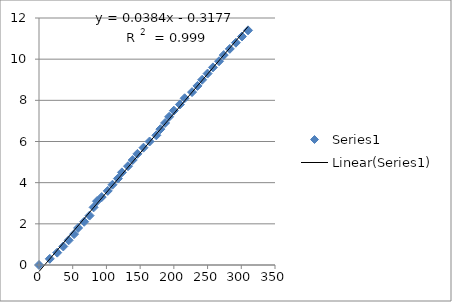
| Category | Series 0 |
|---|---|
| 0.0 | 0 |
| 16.0 | 0.3 |
| 27.0 | 0.6 |
| 36.0 | 0.9 |
| 44.0 | 1.2 |
| 52.0 | 1.5 |
| 58.0 | 1.8 |
| 67.0 | 2.1 |
| 75.0 | 2.4 |
| 81.0 | 2.8 |
| 86.0 | 3.1 |
| 93.0 | 3.3 |
| 102.0 | 3.6 |
| 109.0 | 3.9 |
| 117.0 | 4.2 |
| 123.0 | 4.5 |
| 132.0 | 4.8 |
| 139.0 | 5.1 |
| 146.0 | 5.4 |
| 155.0 | 5.7 |
| 164.0 | 6 |
| 174.0 | 6.3 |
| 180.0 | 6.6 |
| 187.0 | 6.9 |
| 193.0 | 7.2 |
| 200.0 | 7.5 |
| 209.0 | 7.8 |
| 216.0 | 8.1 |
| 227.0 | 8.4 |
| 235.0 | 8.7 |
| 242.0 | 9 |
| 250.0 | 9.3 |
| 258.0 | 9.6 |
| 267.0 | 9.9 |
| 274.0 | 10.2 |
| 283.0 | 10.5 |
| 292.0 | 10.8 |
| 301.0 | 11.1 |
| 310.0 | 11.4 |